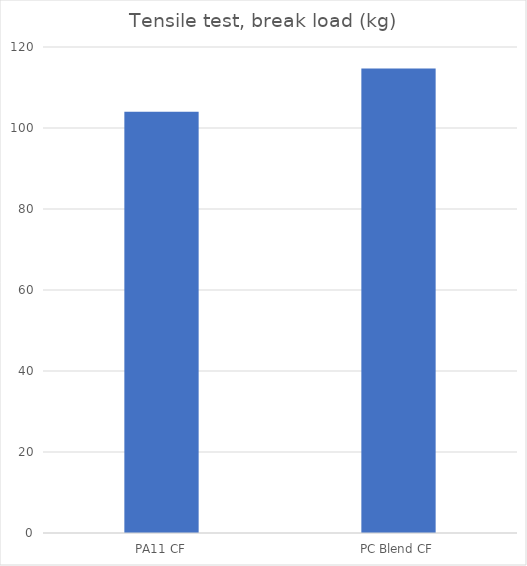
| Category | Average (kg) |
|---|---|
| PA11 CF | 104 |
| PC Blend CF | 114.7 |